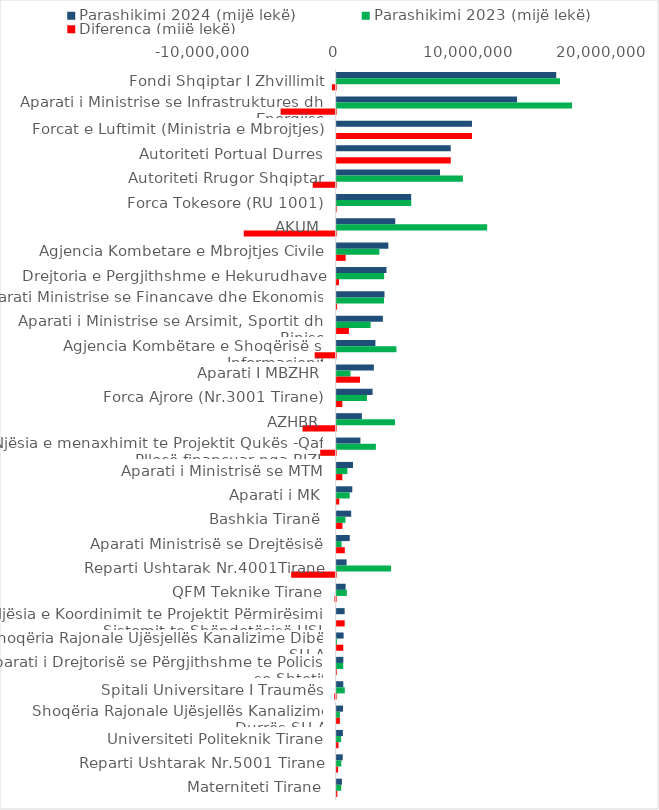
| Category | Parashikimi 2024 (mijë lekë) | Parashikimi 2023 (mijë lekë) | Diferenca (mijë lekë) |
|---|---|---|---|
| Fondi Shqiptar I Zhvillimit | 16550000.001 | 16835128 | -285127.999 |
| Aparati i Ministrise se Infrastruktures dhe Energjise | 13596081 | 17742654.57 | -4146573.57 |
| Forcat e Luftimit (Ministria e Mbrojtjes) | 10200000 | 0 | 10200000 |
| Autoriteti Portual Durres | 8600000 | 0 | 8600000 |
| Autoriteti Rrugor Shqiptar | 7790634 | 9519062 | -1728428 |
| Forca Tokesore (RU 1001) | 5614805 | 5624080 | -9275 |
| AKUM | 4414033.085 | 11343555.439 | -6929522.354 |
| Agjencia Kombetare e Mbrojtjes Civile | 3896050 | 3219300 | 676750 |
| Drejtoria e Pergjithshme e Hekurudhave | 3752393 | 3577649 | 174744 |
| Aparati Ministrise se Financave dhe Ekonomise | 3604152 | 3569779 | 34373 |
| Aparati i Ministrise se Arsimit, Sportit dhe Rinise | 3484764.128 | 2560215.305 | 924548.823 |
| Agjencia Kombëtare e Shoqërisë se Informacionit | 2920000 | 4503266 | -1583266 |
| Aparati I MBZHR | 2803767 | 1041884 | 1761883 |
| Forca Ajrore (Nr.3001 Tirane) | 2706195 | 2284920 | 421275 |
| AZHBR | 1901310 | 4398511.06 | -2497201.06 |
| Njësia e menaxhimit te Projektit Qukës -Qafe Plloçë financuar nga BIZH | 1789632 | 2955698 | -1166066 |
| Aparati i Ministrisë se MTM | 1232687 | 809100 | 423587 |
| Aparati i MK | 1177188 | 982461 | 194727 |
| Bashkia Tiranë | 1095312 | 660039 | 435273 |
| Aparati Ministrisë se Drejtësisë | 985620 | 372151 | 613469 |
| Reparti Ushtarak Nr.4001Tirane | 747120 | 4100000 | -3352880 |
| QFM Teknike Tirane | 673695 | 765992 | -92297 |
| Njësia e Koordinimit te Projektit Përmirësimi i Sistemit te Shëndetësisë HSIP | 602000 | 0 | 602000 |
| Shoqëria Rajonale Ujësjellës Kanalizime Dibër SH.A | 524057.213 | 23500 | 500557.213 |
| Aparati i Drejtorisë se Përgjithshme te Policisë se Shtetit | 503335 | 494850 | 8485 |
| Spitali Universitare I Traumës | 500000 | 610700 | -110700 |
| Shoqëria Rajonale Ujësjellës Kanalizime Durrës SH.A | 481081.764 | 241353.163 | 239728.601 |
| Universiteti Politeknik Tirane | 470000 | 335000 | 135000 |
| Reparti Ushtarak Nr.5001 Tirane | 457000 | 350000 | 107000 |
| Materniteti Tirane | 395345.371 | 344515.951 | 50829.42 |